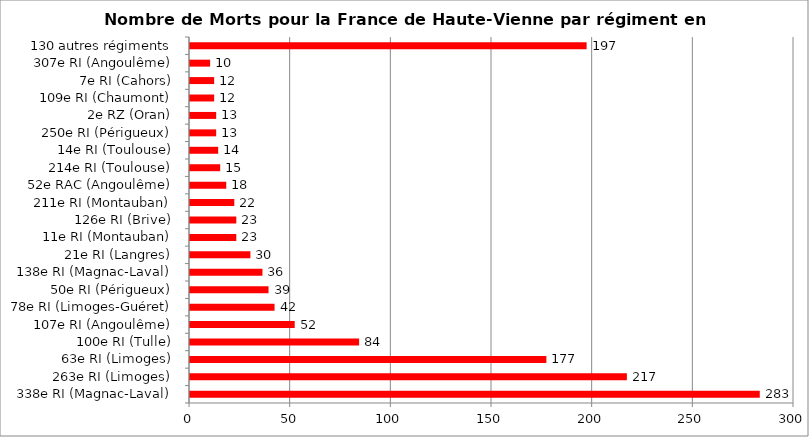
| Category | Nombre de Morts pour la France de Haute-Vienne par régiment en août 1914 |
|---|---|
| 338e RI (Magnac-Laval) | 283 |
| 263e RI (Limoges) | 217 |
| 63e RI (Limoges) | 177 |
| 100e RI (Tulle) | 84 |
| 107e RI (Angoulême) | 52 |
| 78e RI (Limoges-Guéret) | 42 |
| 50e RI (Périgueux) | 39 |
| 138e RI (Magnac-Laval) | 36 |
| 21e RI (Langres) | 30 |
| 11e RI (Montauban) | 23 |
| 126e RI (Brive) | 23 |
| 211e RI (Montauban) | 22 |
| 52e RAC (Angoulême) | 18 |
| 214e RI (Toulouse) | 15 |
| 14e RI (Toulouse) | 14 |
| 250e RI (Périgueux) | 13 |
| 2e RZ (Oran) | 13 |
| 109e RI (Chaumont) | 12 |
| 7e RI (Cahors) | 12 |
| 307e RI (Angoulême) | 10 |
| 130 autres régiments | 197 |